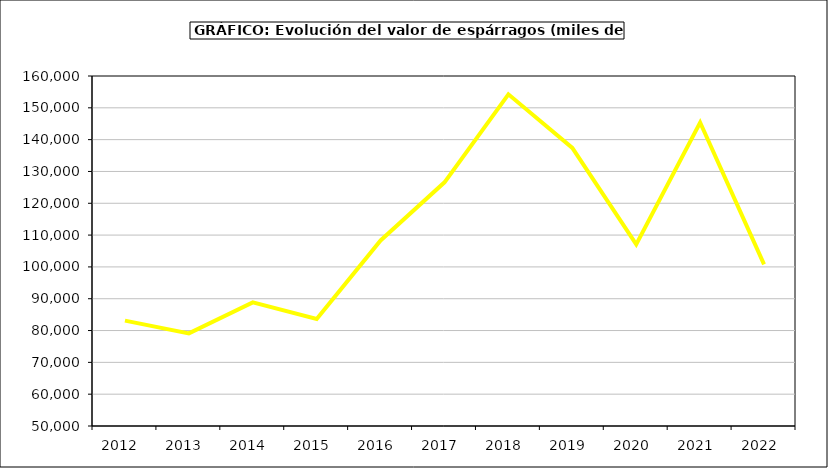
| Category | Valor |
|---|---|
| 2012.0 | 83128.666 |
| 2013.0 | 79103.985 |
| 2014.0 | 88833.6 |
| 2015.0 | 83613.501 |
| 2016.0 | 108300 |
| 2017.0 | 126575 |
| 2018.0 | 154241.925 |
| 2019.0 | 137405.283 |
| 2020.0 | 107060.102 |
| 2021.0 | 145400.116 |
| 2022.0 | 100780.068 |